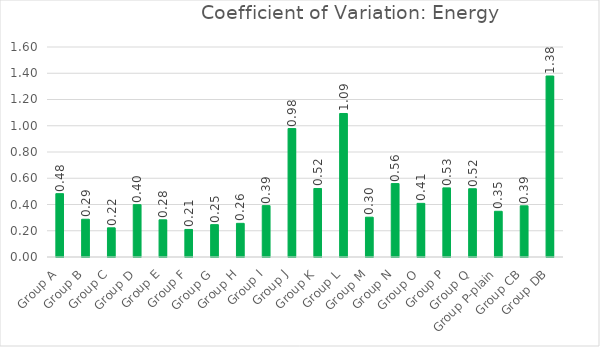
| Category | Coefficient of Variation |
|---|---|
| Group A | 0.483 |
| Group B | 0.288 |
| Group C | 0.222 |
| Group D | 0.399 |
| Group E | 0.283 |
| Group F | 0.21 |
| Group G | 0.246 |
| Group H | 0.256 |
| Group I | 0.391 |
| Group J | 0.978 |
| Group K | 0.522 |
| Group L | 1.093 |
| Group M | 0.303 |
| Group N | 0.559 |
| Group O | 0.409 |
| Group P | 0.527 |
| Group Q | 0.52 |
| Group P-plain | 0.348 |
| Group CB | 0.39 |
| Group DB | 1.379 |